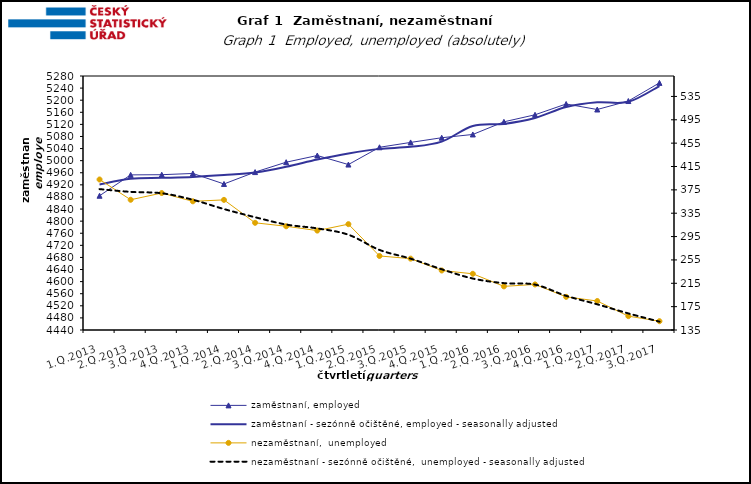
| Category | zaměstnaní, employed | zaměstnaní - sezónně očištěné, employed - seasonally adjusted |
|---|---|---|
| 1.Q.2013 | 4884.025 | 4921.298 |
| 2.Q.2013 | 4952.991 | 4940.38 |
| 3.Q.2013 | 4953.606 | 4943.118 |
| 4.Q.2013 | 4957.713 | 4946.225 |
| 1.Q.2014 | 4922.963 | 4952.405 |
| 2.Q.2014 | 4962.219 | 4960.65 |
| 3.Q.2014 | 4994.947 | 4979.618 |
| 4.Q.2014 | 5017.051 | 5003.629 |
| 1.Q.2015 | 4987.141 | 5023.827 |
| 2.Q.2015 | 5044.285 | 5038.984 |
| 3.Q.2015 | 5060.3 | 5045.647 |
| 4.Q.2015 | 5075.884 | 5063.085 |
| 1.Q.2016 | 5086.671 | 5114.698 |
| 2.Q.2016 | 5128.493 | 5121.602 |
| 3.Q.2016 | 5151.712 | 5140.967 |
| 4.Q.2016 | 5187.436 | 5177.35 |
| 1.Q.2017 | 5169.203 | 5192.941 |
| 2.Q.2017 | 5197.265 | 5194.555 |
| 3.Q.2017 | 5257.26 | 5246.726 |